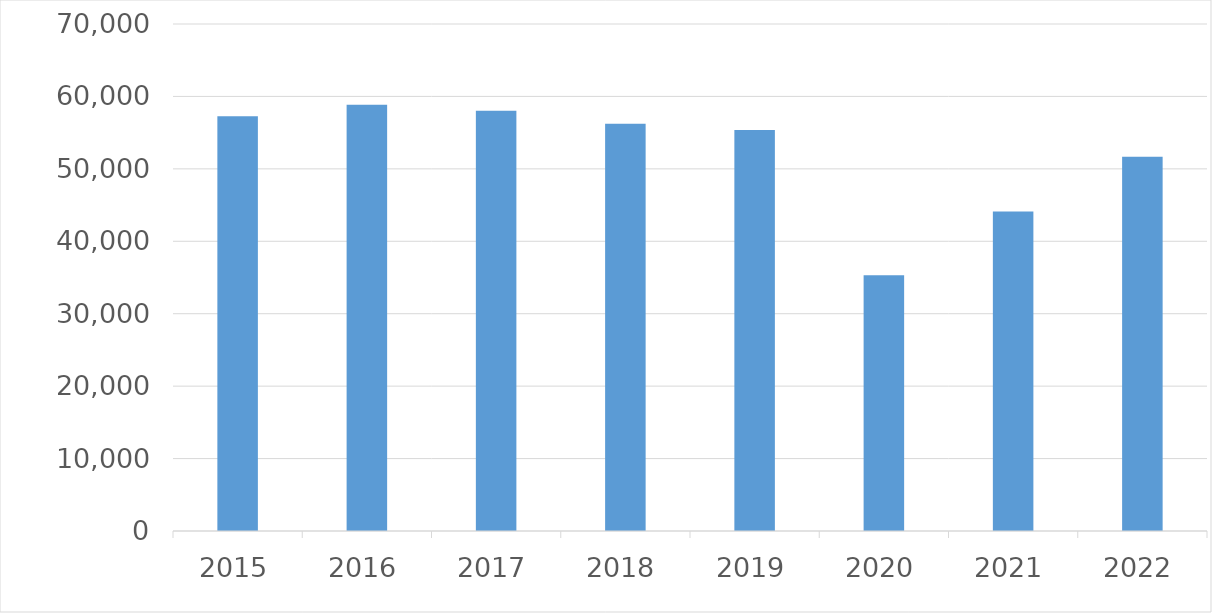
| Category | Series 0 |
|---|---|
| 2015 | 57272 |
| 2016 | 58861 |
| 2017 | 58025 |
| 2018 | 56231 |
| 2019 | 55353 |
| 2020 | 35315 |
| 2021 | 44124 |
| 2022 | 51678 |